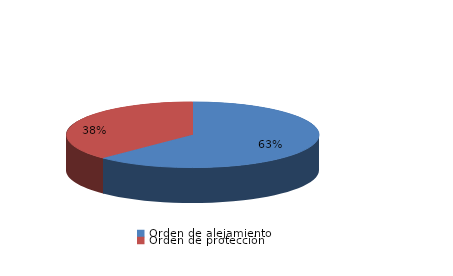
| Category | Series 0 |
|---|---|
| Orden de alejamiento | 15 |
| Orden de protección | 9 |